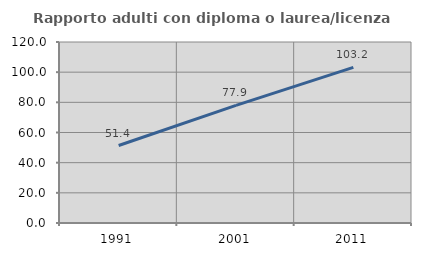
| Category | Rapporto adulti con diploma o laurea/licenza media  |
|---|---|
| 1991.0 | 51.359 |
| 2001.0 | 77.943 |
| 2011.0 | 103.153 |